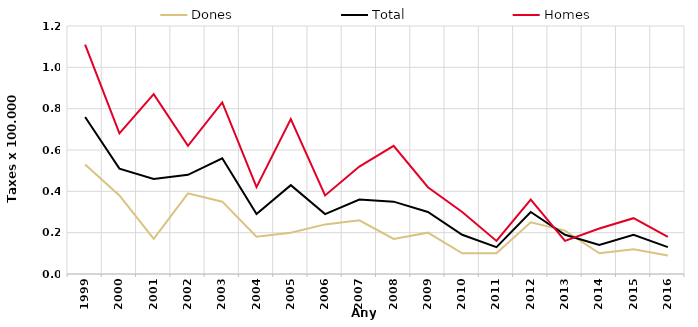
| Category | Dones | Total | Homes |
|---|---|---|---|
| 1999.0 | 0.53 | 0.76 | 1.11 |
| 2000.0 | 0.38 | 0.51 | 0.68 |
| 2001.0 | 0.17 | 0.46 | 0.87 |
| 2002.0 | 0.39 | 0.48 | 0.62 |
| 2003.0 | 0.35 | 0.56 | 0.83 |
| 2004.0 | 0.18 | 0.29 | 0.42 |
| 2005.0 | 0.2 | 0.43 | 0.75 |
| 2006.0 | 0.24 | 0.29 | 0.38 |
| 2007.0 | 0.26 | 0.36 | 0.52 |
| 2008.0 | 0.17 | 0.35 | 0.62 |
| 2009.0 | 0.2 | 0.3 | 0.42 |
| 2010.0 | 0.1 | 0.19 | 0.3 |
| 2011.0 | 0.1 | 0.13 | 0.16 |
| 2012.0 | 0.25 | 0.3 | 0.36 |
| 2013.0 | 0.21 | 0.19 | 0.16 |
| 2014.0 | 0.1 | 0.14 | 0.22 |
| 2015.0 | 0.12 | 0.19 | 0.27 |
| 2016.0 | 0.09 | 0.13 | 0.18 |